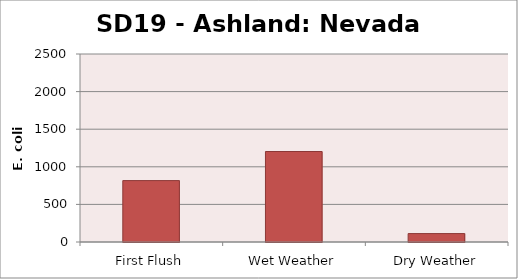
| Category | E. coli MPN |
|---|---|
| First Flush | 816.4 |
| Wet Weather | 1203.3 |
| Dry Weather | 111.9 |